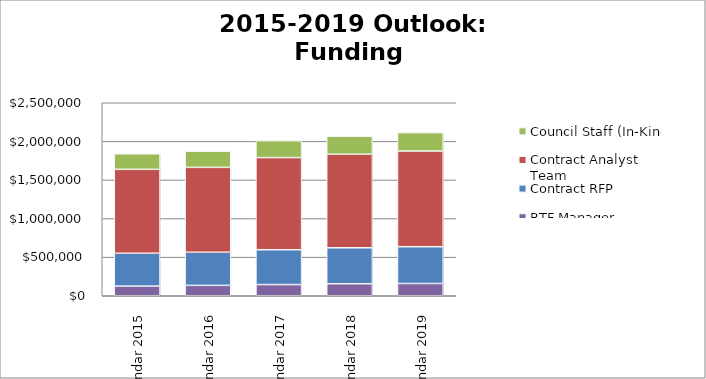
| Category | RTF Manager | Contract RFP | Contract Analyst Team | Council Staff (In-Kind) |
|---|---|---|---|---|
| Calendar 2015 | 125000 | 425600 | 1087000 | 201600 |
| Calendar 2016 | 134500 | 429500 | 1099200 | 209200 |
| Calendar 2017 | 144800 | 451300 | 1193700 | 219600 |
| Calendar 2018 | 155800 | 465600 | 1212600 | 233000 |
| Calendar 2019 | 158900 | 476500 | 1239700 | 238000 |